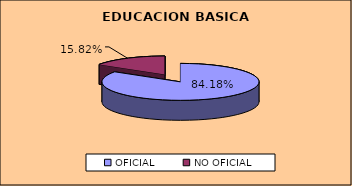
| Category | SECUNDARIA | % |
|---|---|---|
| OFICIAL | 70830 | 84.184 |
| NO OFICIAL | 13307 | 15.816 |